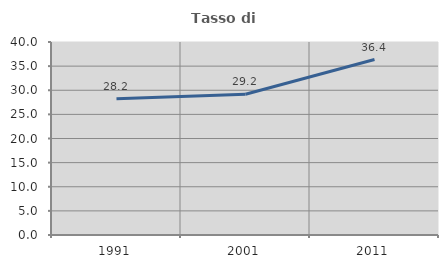
| Category | Tasso di occupazione   |
|---|---|
| 1991.0 | 28.232 |
| 2001.0 | 29.174 |
| 2011.0 | 36.362 |